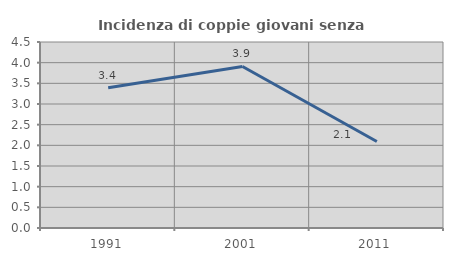
| Category | Incidenza di coppie giovani senza figli |
|---|---|
| 1991.0 | 3.393 |
| 2001.0 | 3.909 |
| 2011.0 | 2.093 |